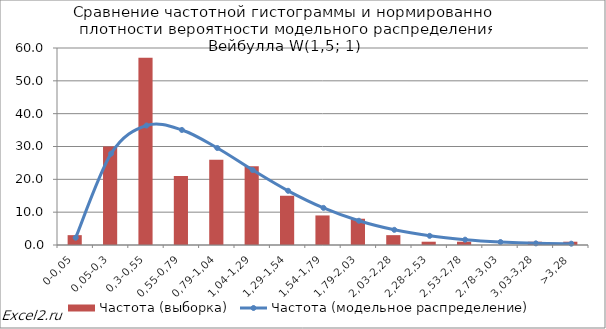
| Category | Частота (выборка) |
|---|---|
| 0 | 3 |
| 1 | 30 |
| 2 | 57 |
| 3 | 21 |
| 4 | 26 |
| 5 | 24 |
| 6 | 15 |
| 7 | 9 |
| 8 | 8 |
| 9 | 3 |
| 10 | 1 |
| 11 | 1 |
| 12 | 0 |
| 13 | 1 |
| 14 | 1 |